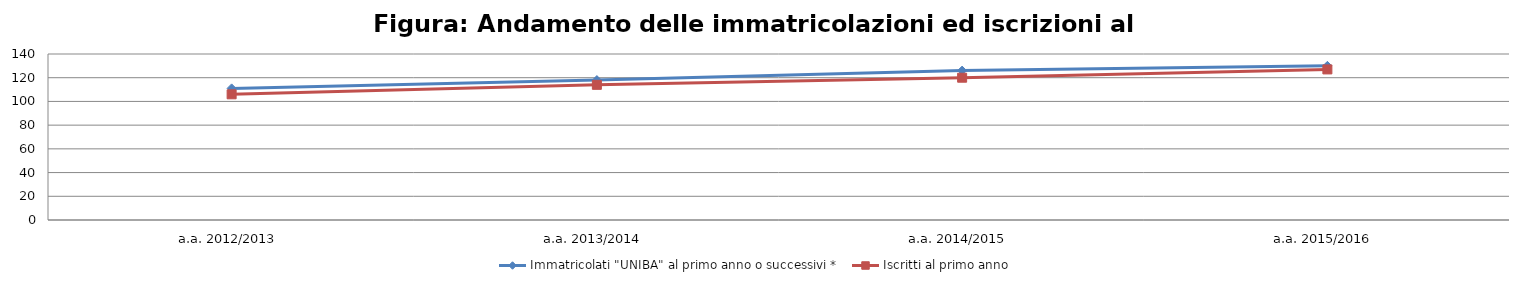
| Category | Immatricolati "UNIBA" al primo anno o successivi * | Iscritti al primo anno  |
|---|---|---|
| a.a. 2012/2013 | 111 | 106 |
| a.a. 2013/2014 | 118 | 114 |
| a.a. 2014/2015 | 126 | 120 |
| a.a. 2015/2016 | 130 | 127 |